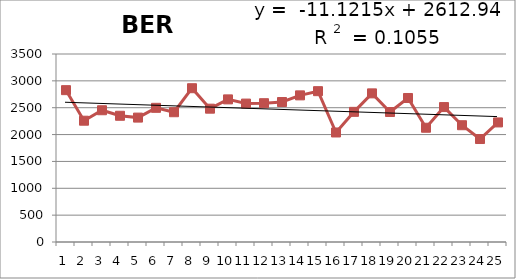
| Category | 1988-2012 |
|---|---|
| 0 | 2827 |
| 1 | 2258 |
| 2 | 2453 |
| 3 | 2350 |
| 4 | 2316 |
| 5 | 2498 |
| 6 | 2416 |
| 7 | 2863 |
| 8 | 2482 |
| 9 | 2655 |
| 10 | 2577 |
| 11 | 2584 |
| 12 | 2606 |
| 13 | 2730 |
| 14 | 2808 |
| 15 | 2039 |
| 16 | 2423 |
| 17 | 2767 |
| 18 | 2420 |
| 19 | 2681 |
| 20 | 2127 |
| 21 | 2512 |
| 22 | 2174 |
| 23 | 1917 |
| 24 | 2226 |